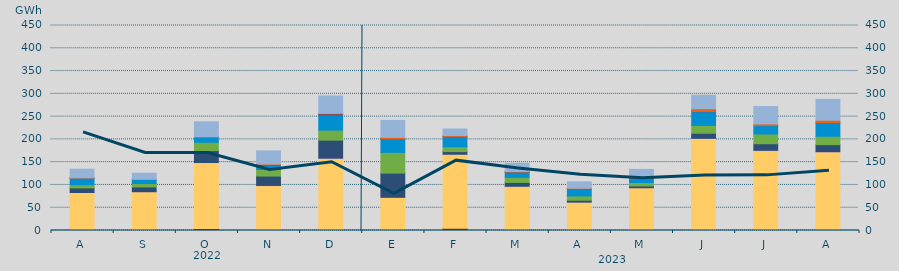
| Category | Carbón | Ciclo Combinado | Cogeneración | Consumo Bombeo | Eólica | Hidráulica | Nuclear | Otras Renovables | Solar fotovoltaica | Solar térmica | Turbinación bombeo |
|---|---|---|---|---|---|---|---|---|---|---|---|
| A | 2452.3 | 80908.85 | 69.8 | 10038.425 | 6983.45 | 14747.025 | 33 | 0 | 300.1 | 0 | 19076.4 |
| S | 2236 | 82926.675 | 23 | 10509.975 | 7386.425 | 8900.725 | 0 | 0 | 476.125 | 0 | 13369.775 |
| O | 4283 | 144842.475 | 127.925 | 26134.8 | 18277.325 | 11041.025 | 22.5 | 0 | 1111.175 | 0 | 32778.95 |
| N | 861.375 | 97623.7 | 419.15 | 20591.575 | 14440 | 9978.175 | 722.075 | 1 | 1239.075 | 0 | 28866.575 |
| D | 2372.95 | 155746.55 | 697.65 | 39478.975 | 22031.425 | 33537.4 | 2006.425 | 0 | 1334.875 | 0 | 38128.575 |
| E | 1284.5 | 71547.4 | 0 | 53164.775 | 45462.95 | 28173.35 | 832.7 | 0 | 3920.525 | 0 | 37262.825 |
| F | 5209.75 | 162258.025 | 4.5 | 5734.4 | 10650.1 | 22890.65 | 0 | 26 | 1697.2 | 0 | 14370.575 |
| M | 1206.25 | 95878.75 | 28.525 | 8412.525 | 10950.5 | 11649.375 | 291.075 | 0 | 997.65 | 0 | 18026.625 |
| A | 95 | 62173.25 | 34.425 | 4159.95 | 9407.775 | 15400.95 | 65.5 | 0 | 1513.55 | 0 | 13985.1 |
| M | 53 | 93854.15 | 22.625 | 3893.75 | 7479.975 | 9063.875 | 377.575 | 0 | 1716.575 | 0 | 17696.4 |
| J | 1199.5 | 200824.35 | 314.8 | 11178.5 | 17206.65 | 30102.475 | 201.5 | 0 | 6216.85 | 0 | 29529.225 |
| J | 468.8 | 174954.2 | 648.625 | 14357.5 | 21420.05 | 18314.475 | 0 | 0 | 3759.55 | 0 | 38182.8 |
| A | 2071.15 | 170328.85 | 646.325 | 15367.25 | 18494.75 | 30120.575 | 0 | 0 | 4976.775 | 0 | 45807.425 |